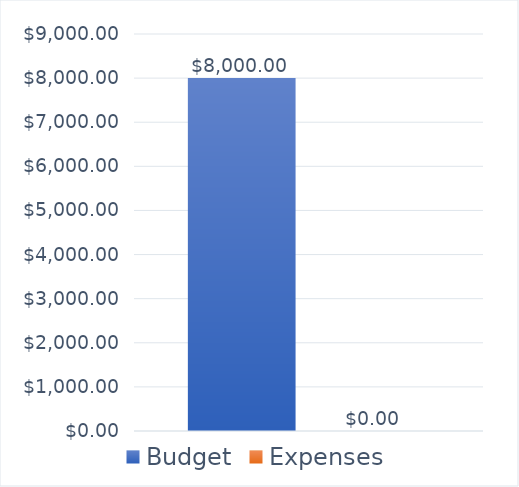
| Category | Budget | Expenses |
|---|---|---|
| 0 | 8000 | 0 |